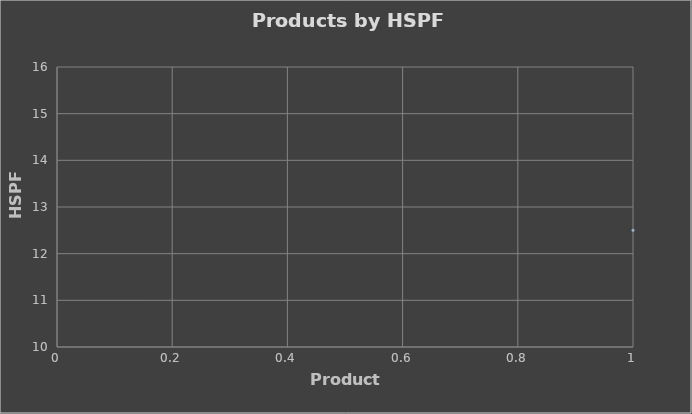
| Category | Series 0 |
|---|---|
| 0 | 12.5 |
| 1 | 12 |
| 2 | 11 |
| 3 | 11 |
| 4 | 12 |
| 5 | 13 |
| 6 | 12.5 |
| 7 | 13 |
| 8 | 10 |
| 9 | 10 |
| 10 | 10 |
| 11 | 11 |
| 12 | 10.5 |
| 13 | 10.2 |
| 14 | 10.5 |
| 15 | 11 |
| 16 | 10 |
| 17 | 10 |
| 18 | 10 |
| 19 | 10 |
| 20 | 10 |
| 21 | 10 |
| 22 | 10 |
| 23 | 10 |
| 24 | 10 |
| 25 | 10 |
| 26 | 10 |
| 27 | 10 |
| 28 | 10 |
| 29 | 10 |
| 30 | 10 |
| 31 | 10 |
| 32 | 10.6 |
| 33 | 10 |
| 34 | 10.2 |
| 35 | 11 |
| 36 | 11.3 |
| 37 | 10.7 |
| 38 | 11 |
| 39 | 10 |
| 40 | 10.8 |
| 41 | 10.8 |
| 42 | 11 |
| 43 | 11 |
| 44 | 10 |
| 45 | 10 |
| 46 | 10.5 |
| 47 | 10.5 |
| 48 | 10.5 |
| 49 | 12 |
| 50 | 10.6 |
| 51 | 12 |
| 52 | 11 |
| 53 | 11 |
| 54 | 10 |
| 55 | 10.3 |
| 56 | 10.3 |
| 57 | 10.3 |
| 58 | 14 |
| 59 | 13.4 |
| 60 | 13.8 |
| 61 | 13.3 |
| 62 | 10.5 |
| 63 | 14.2 |
| 64 | 14 |
| 65 | 11 |
| 66 | 11 |
| 67 | 10 |
| 68 | 12 |
| 69 | 10.3 |
| 70 | 10.3 |
| 71 | 10.7 |
| 72 | 12.5 |
| 73 | 10 |
| 74 | 10 |
| 75 | 10 |
| 76 | 10 |
| 77 | 10 |
| 78 | 10 |
| 79 | 10.3 |
| 80 | 10.3 |
| 81 | 10.3 |
| 82 | 10.3 |
| 83 | 10.3 |
| 84 | 10.3 |
| 85 | 10.3 |
| 86 | 10.3 |
| 87 | 10.3 |
| 88 | 10.3 |
| 89 | 10.3 |
| 90 | 10.3 |
| 91 | 10.3 |
| 92 | 10.3 |
| 93 | 10.3 |
| 94 | 10.3 |
| 95 | 10.3 |
| 96 | 10.3 |
| 97 | 10.3 |
| 98 | 10.3 |
| 99 | 10.3 |
| 100 | 10.1 |
| 101 | 10.4 |
| 102 | 10.1 |
| 103 | 10.4 |
| 104 | 10 |
| 105 | 10 |
| 106 | 12.5 |
| 107 | 12 |
| 108 | 11 |
| 109 | 10.4 |
| 110 | 10 |
| 111 | 12 |
| 112 | 11.5 |
| 113 | 10.5 |
| 114 | 10.7 |
| 115 | 11.4 |
| 116 | 11.4 |
| 117 | 14.2 |
| 118 | 14 |
| 119 | 14 |
| 120 | 11.5 |
| 121 | 13.8 |
| 122 | 13.4 |
| 123 | 13.3 |
| 124 | 12.5 |
| 125 | 11.7 |
| 126 | 11.2 |
| 127 | 10 |
| 128 | 10.5 |
| 129 | 10.5 |
| 130 | 10.6 |
| 131 | 10.5 |
| 132 | 10.1 |
| 133 | 10 |
| 134 | 12.5 |
| 135 | 11 |
| 136 | 10 |
| 137 | 10.1 |
| 138 | 11.2 |
| 139 | 12 |
| 140 | 10.3 |
| 141 | 10.3 |
| 142 | 12 |
| 143 | 11.2 |
| 144 | 10 |
| 145 | 10 |
| 146 | 10 |
| 147 | 10 |
| 148 | 10 |
| 149 | 10 |
| 150 | 10 |
| 151 | 10 |
| 152 | 10 |
| 153 | 10 |
| 154 | 10 |
| 155 | 10 |
| 156 | 10 |
| 157 | 10 |
| 158 | 10 |
| 159 | 10 |
| 160 | 10 |
| 161 | 10 |
| 162 | 10 |
| 163 | 10 |
| 164 | 10 |
| 165 | 10 |
| 166 | 10 |
| 167 | 10 |
| 168 | 10 |
| 169 | 10 |
| 170 | 10 |
| 171 | 10 |
| 172 | 10 |
| 173 | 10 |
| 174 | 11.5 |
| 175 | 10.5 |
| 176 | 10.5 |
| 177 | 10.3 |
| 178 | 10.5 |
| 179 | 10.5 |
| 180 | 11 |
| 181 | 10.4 |
| 182 | 10.5 |
| 183 | 11.5 |
| 184 | 12 |
| 185 | 11.2 |
| 186 | 13.5 |
| 187 | 12.5 |
| 188 | 12 |
| 189 | 11 |
| 190 | 12.5 |
| 191 | 11.3 |
| 192 | 12 |
| 193 | 12 |
| 194 | 11.7 |
| 195 | 12.5 |
| 196 | 10.3 |
| 197 | 12.5 |
| 198 | 13 |
| 199 | 11.6 |
| 200 | 11.3 |
| 201 | 10.5 |
| 202 | 10.5 |
| 203 | 10.5 |
| 204 | 10.5 |
| 205 | 14 |
| 206 | 12.5 |
| 207 | 13 |
| 208 | 12 |
| 209 | 10 |
| 210 | 10.5 |
| 211 | 10 |
| 212 | 10 |
| 213 | 10 |
| 214 | 10.3 |
| 215 | 11.8 |
| 216 | 10.6 |
| 217 | 10.2 |
| 218 | 10 |
| 219 | 10 |
| 220 | 10 |
| 221 | 11.2 |
| 222 | 12 |
| 223 | 11.5 |
| 224 | 10.5 |
| 225 | 11.7 |
| 226 | 11.4 |
| 227 | 10 |
| 228 | 11 |
| 229 | 10.4 |
| 230 | 10.5 |
| 231 | 10 |
| 232 | 10.5 |
| 233 | 10 |
| 234 | 11.2 |
| 235 | 12 |
| 236 | 11.5 |
| 237 | 10 |
| 238 | 10 |
| 239 | 10 |
| 240 | 11 |
| 241 | 11.5 |
| 242 | 11.5 |
| 243 | 10.5 |
| 244 | 11 |
| 245 | 10.5 |
| 246 | 10 |
| 247 | 10 |
| 248 | 10 |
| 249 | 12 |
| 250 | 10.3 |
| 251 | 10.3 |
| 252 | 10.5 |
| 253 | 10.5 |
| 254 | 10.2 |
| 255 | 10.2 |
| 256 | 10 |
| 257 | 10 |
| 258 | 10 |
| 259 | 12 |
| 260 | 10 |
| 261 | 10 |
| 262 | 11 |
| 263 | 15 |
| 264 | 15 |
| 265 | 14 |
| 266 | 14 |
| 267 | 12 |
| 268 | 12 |
| 269 | 12 |
| 270 | 12 |
| 271 | 12 |
| 272 | 12 |
| 273 | 12.5 |
| 274 | 10.8 |
| 275 | 11 |
| 276 | 10.4 |
| 277 | 11.5 |
| 278 | 10.5 |
| 279 | 10 |
| 280 | 10 |
| 281 | 10 |
| 282 | 10 |
| 283 | 12 |
| 284 | 10.5 |
| 285 | 10.5 |
| 286 | 10.5 |
| 287 | 10.5 |
| 288 | 10.5 |
| 289 | 11 |
| 290 | 11 |
| 291 | 11 |
| 292 | 11 |
| 293 | 11 |
| 294 | 11.5 |
| 295 | 11.5 |
| 296 | 11 |
| 297 | 11.5 |
| 298 | 11.5 |
| 299 | 10 |
| 300 | 10 |
| 301 | 10 |
| 302 | 10.5 |
| 303 | 10.5 |
| 304 | 10.5 |
| 305 | 10.5 |
| 306 | 10.5 |
| 307 | 10.5 |
| 308 | 11 |
| 309 | 11 |
| 310 | 11 |
| 311 | 10.5 |
| 312 | 10.5 |
| 313 | 10.5 |
| 314 | 10.5 |
| 315 | 10.5 |
| 316 | 11 |
| 317 | 11 |
| 318 | 11 |
| 319 | 11 |
| 320 | 11 |
| 321 | 11 |
| 322 | 11 |
| 323 | 11 |
| 324 | 11 |
| 325 | 11 |
| 326 | 11 |
| 327 | 11 |
| 328 | 11 |
| 329 | 11 |
| 330 | 11 |
| 331 | 11 |
| 332 | 11.5 |
| 333 | 11.5 |
| 334 | 11.5 |
| 335 | 11.5 |
| 336 | 11.5 |
| 337 | 11.5 |
| 338 | 11.5 |
| 339 | 11.5 |
| 340 | 11.5 |
| 341 | 11.5 |
| 342 | 11.5 |
| 343 | 11.5 |
| 344 | 10.5 |
| 345 | 10.5 |
| 346 | 10.5 |
| 347 | 10.5 |
| 348 | 10.5 |
| 349 | 10.5 |
| 350 | 11 |
| 351 | 11 |
| 352 | 11 |
| 353 | 11 |
| 354 | 11 |
| 355 | 11 |
| 356 | 10.5 |
| 357 | 10.5 |
| 358 | 10.5 |
| 359 | 10.5 |
| 360 | 11 |
| 361 | 11 |
| 362 | 11 |
| 363 | 11 |
| 364 | 11 |
| 365 | 11 |
| 366 | 11 |
| 367 | 11 |
| 368 | 13 |
| 369 | 10.5 |
| 370 | 10.5 |
| 371 | 11.5 |
| 372 | 11 |
| 373 | 11.5 |
| 374 | 11.5 |
| 375 | 11.5 |
| 376 | 11.5 |
| 377 | 11 |
| 378 | 11 |
| 379 | 11 |
| 380 | 10.5 |
| 381 | 10.5 |
| 382 | 11 |
| 383 | 11 |
| 384 | 11 |
| 385 | 11 |
| 386 | 11 |
| 387 | 11.5 |
| 388 | 10.5 |
| 389 | 10.5 |
| 390 | 10.5 |
| 391 | 10.5 |
| 392 | 11 |
| 393 | 11 |
| 394 | 10.5 |
| 395 | 11 |
| 396 | 11 |
| 397 | 11 |
| 398 | 11.5 |
| 399 | 11.5 |
| 400 | 11.5 |
| 401 | 11.5 |
| 402 | 11.5 |
| 403 | 11 |
| 404 | 11.5 |
| 405 | 11.5 |
| 406 | 11 |
| 407 | 11.5 |
| 408 | 11.5 |
| 409 | 10.5 |
| 410 | 10.5 |
| 411 | 11 |
| 412 | 11 |
| 413 | 11 |
| 414 | 11 |
| 415 | 11 |
| 416 | 11 |
| 417 | 10.5 |
| 418 | 11 |
| 419 | 11 |
| 420 | 10.5 |
| 421 | 10.5 |
| 422 | 10.5 |
| 423 | 11 |
| 424 | 11 |